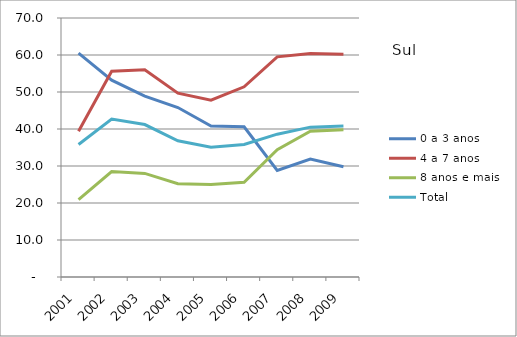
| Category | 0 a 3 anos | 4 a 7 anos | 8 anos e mais | Total |
|---|---|---|---|---|
| 2001.0 | 60.5 | 39.4 | 20.9 | 35.8 |
| 2002.0 | 53.2 | 55.6 | 28.5 | 42.7 |
| 2003.0 | 48.9 | 56 | 28 | 41.2 |
| 2004.0 | 45.8 | 49.7 | 25.2 | 36.8 |
| 2005.0 | 40.8 | 47.8 | 25 | 35.1 |
| 2006.0 | 40.6 | 51.4 | 25.6 | 35.8 |
| 2007.0 | 28.8 | 59.5 | 34.4 | 38.6 |
| 2008.0 | 31.9 | 60.4 | 39.4 | 40.5 |
| 2009.0 | 29.8 | 60.2 | 39.8 | 40.8 |